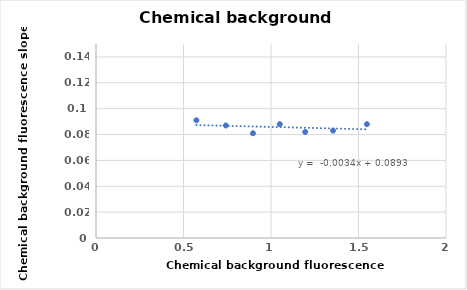
| Category | Series 0 |
|---|---|
| 0.5737 | 0.091 |
| 0.7416 | 0.087 |
| 0.8969 | 0.081 |
| 1.0502 | 0.088 |
| 1.1955 | 0.082 |
| 1.3548 | 0.083 |
| 1.548 | 0.088 |